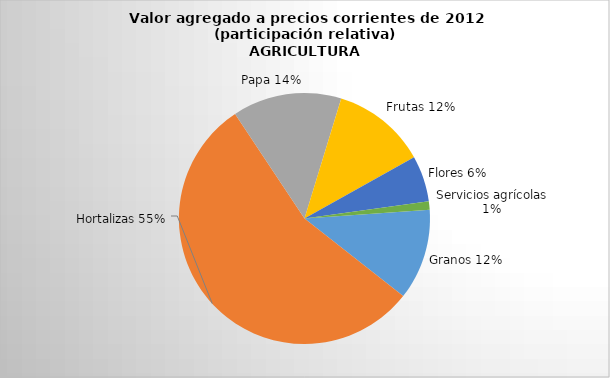
| Category | Series 0 |
|---|---|
| Granos | 86.542 |
| Hortalizas | 406.667 |
| Papa | 103.805 |
| Frutas | 89.756 |
| Flores | 43.755 |
| Servicios agrícolas | 7.996 |